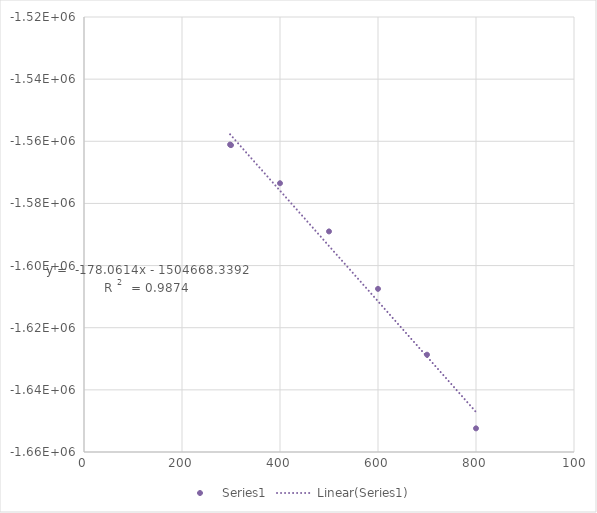
| Category | Series 3 |
|---|---|
| 298.15 | -1561050 |
| 300.0 | -1561240 |
| 400.0 | -1573500 |
| 500.0 | -1589010 |
| 600.0 | -1607490 |
| 700.0 | -1628690 |
| 800.0 | -1652390 |